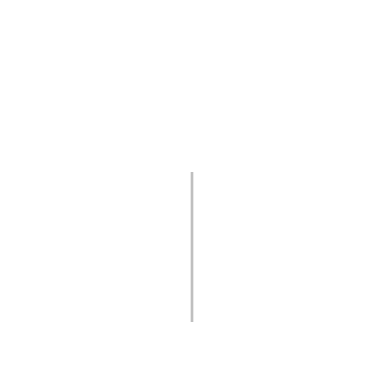
| Category | Positive | Negative |
|---|---|---|
| 0 | 0 | 0 |
| 1 | 192 | 0 |
| 2 | 192 | -192 |